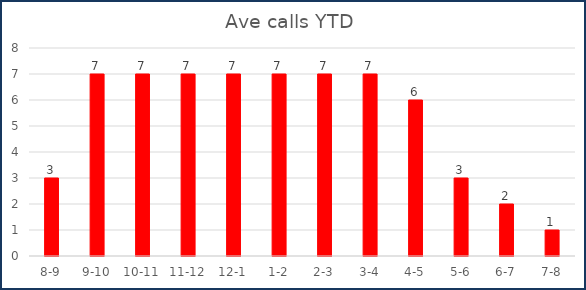
| Category | Ave calls YTD |
|---|---|
| 8-9 | 3 |
| 9-10 | 7 |
| 10-11 | 7 |
| 11-12 | 7 |
| 12-1 | 7 |
| 1-2 | 7 |
| 2-3 | 7 |
| 3-4 | 7 |
| 4-5 | 6 |
| 5-6 | 3 |
| 6-7 | 2 |
| 7-8 | 1 |